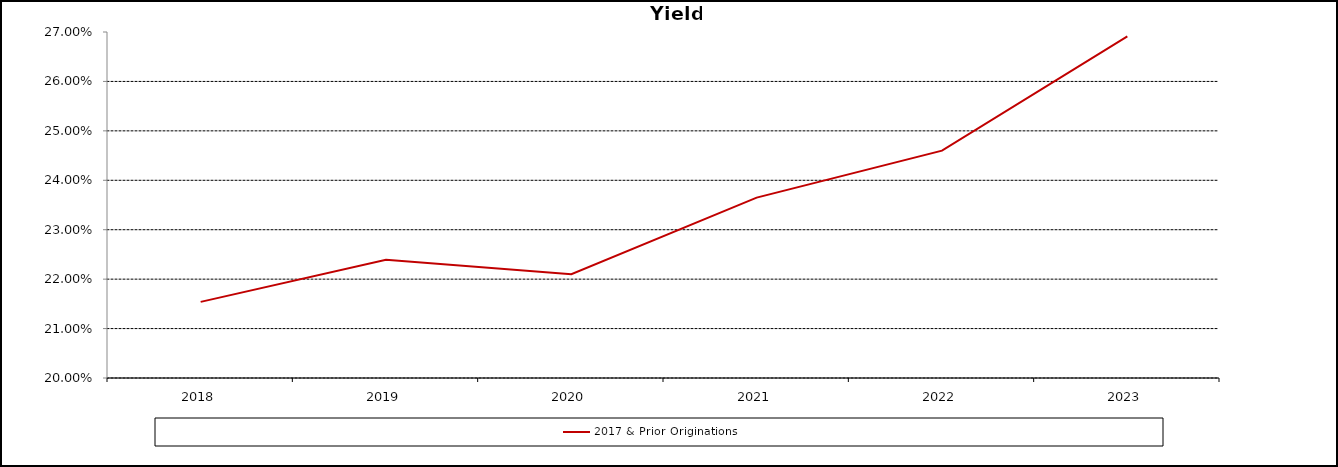
| Category | 2017 & Prior Originations |
|---|---|
| 2018-12-31 | 0.215 |
| 2019-12-31 | 0.224 |
| 2020-12-31 | 0.221 |
| 2021-12-31 | 0.236 |
| 2022-12-31 | 0.246 |
| 2023-09-30 | 0.269 |